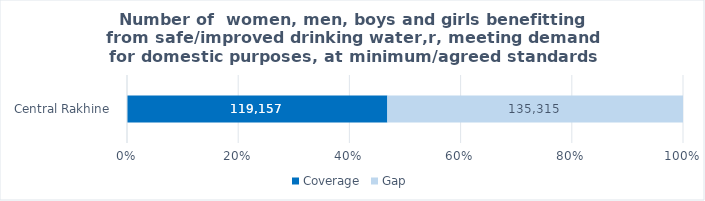
| Category | Coverage |  Gap  |
|---|---|---|
|  Central Rakhine  | 119157 | 135315 |